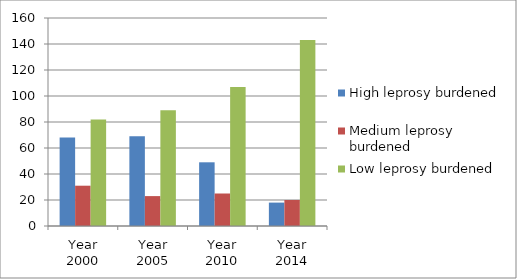
| Category | High leprosy burdened | Medium leprosy burdened | Low leprosy burdened |
|---|---|---|---|
| Year 2000 | 68 | 31 | 82 |
| Year 2005 | 69 | 23 | 89 |
| Year 2010 | 49 | 25 | 107 |
| Year 2014 | 18 | 20 | 143 |